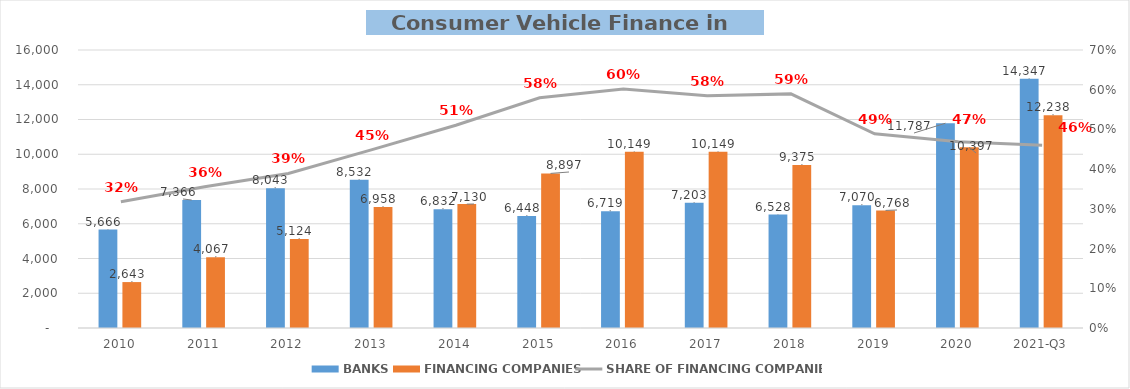
| Category | BANKS | FINANCING COMPANIES |
|---|---|---|
| 2010 | 5665.615 | 2643.169 |
| 2011 | 7366.42 | 4066.867 |
| 2012 | 8042.797 | 5124.261 |
| 2013 | 8531.566 | 6958.23 |
| 2014 | 6832.186 | 7129.957 |
| 2015 | 6447.808 | 8897.137 |
| 2016 | 6719.498 | 10148.982 |
| 2017 | 7202.608 | 10148.903 |
| 2018 | 6528.18 | 9375.099 |
| 2019 | 7070.3 | 6767.535 |
| 2020 | 11786.807 | 10397.228 |
| 2021-Q3 | 14347.348 | 12237.665 |